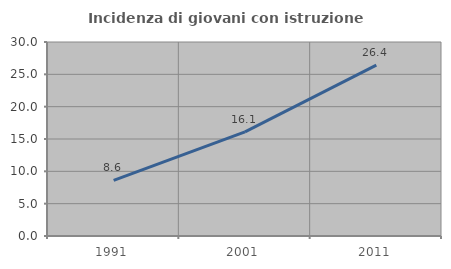
| Category | Incidenza di giovani con istruzione universitaria |
|---|---|
| 1991.0 | 8.594 |
| 2001.0 | 16.102 |
| 2011.0 | 26.437 |